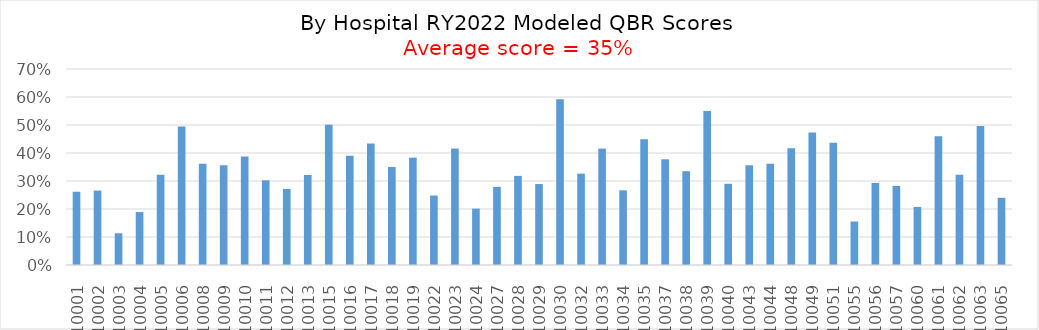
| Category | Series 0 |
|---|---|
| 210001.0 | 0.262 |
| 210002.0 | 0.266 |
| 210003.0 | 0.113 |
| 210004.0 | 0.189 |
| 210005.0 | 0.322 |
| 210006.0 | 0.495 |
| 210008.0 | 0.362 |
| 210009.0 | 0.357 |
| 210010.0 | 0.388 |
| 210011.0 | 0.302 |
| 210012.0 | 0.272 |
| 210013.0 | 0.322 |
| 210015.0 | 0.501 |
| 210016.0 | 0.39 |
| 210017.0 | 0.434 |
| 210018.0 | 0.35 |
| 210019.0 | 0.383 |
| 210022.0 | 0.248 |
| 210023.0 | 0.416 |
| 210024.0 | 0.201 |
| 210027.0 | 0.279 |
| 210028.0 | 0.318 |
| 210029.0 | 0.289 |
| 210030.0 | 0.592 |
| 210032.0 | 0.326 |
| 210033.0 | 0.416 |
| 210034.0 | 0.267 |
| 210035.0 | 0.449 |
| 210037.0 | 0.378 |
| 210038.0 | 0.335 |
| 210039.0 | 0.55 |
| 210040.0 | 0.29 |
| 210043.0 | 0.356 |
| 210044.0 | 0.362 |
| 210048.0 | 0.417 |
| 210049.0 | 0.473 |
| 210051.0 | 0.437 |
| 210055.0 | 0.155 |
| 210056.0 | 0.293 |
| 210057.0 | 0.282 |
| 210060.0 | 0.208 |
| 210061.0 | 0.46 |
| 210062.0 | 0.322 |
| 210063.0 | 0.497 |
| 210065.0 | 0.24 |